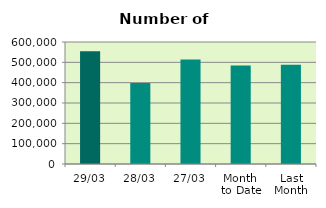
| Category | Series 0 |
|---|---|
| 29/03 | 554446 |
| 28/03 | 398482 |
| 27/03 | 514182 |
| Month 
to Date | 483948.286 |
| Last
Month | 488116.6 |